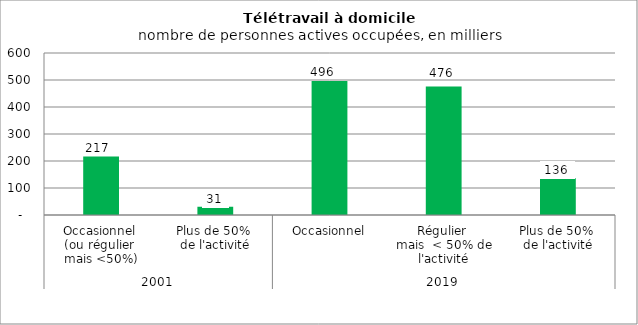
| Category | Télétravail à  domicile |
|---|---|
| 0 | 217 |
| 1 | 31 |
| 2 | 496 |
| 3 | 476 |
| 4 | 136 |